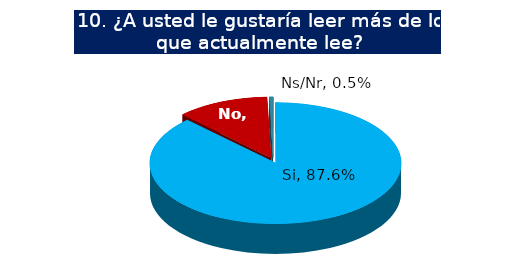
| Category | Series 0 |
|---|---|
| Si | 0.876 |
| No | 0.119 |
| Ns/Nr | 0.005 |